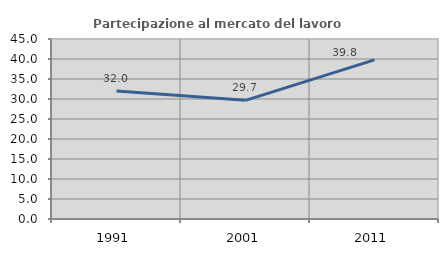
| Category | Partecipazione al mercato del lavoro  femminile |
|---|---|
| 1991.0 | 31.973 |
| 2001.0 | 29.661 |
| 2011.0 | 39.796 |